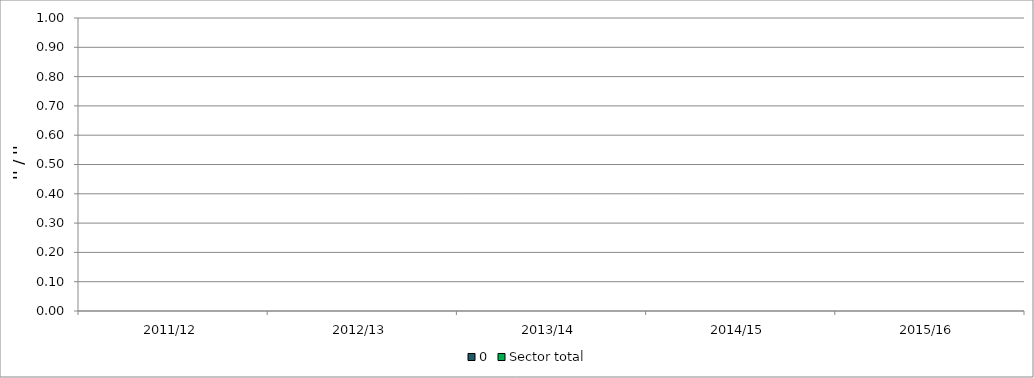
| Category | 0 | Sector total |
|---|---|---|
| 2011/12 | 0 | 0 |
| 2012/13 | 0 | 0 |
| 2013/14 | 0 | 0 |
| 2014/15 | 0 | 0 |
| 2015/16 | 0 | 0 |